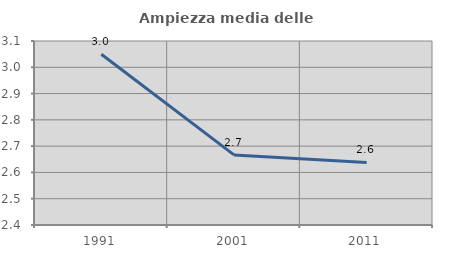
| Category | Ampiezza media delle famiglie |
|---|---|
| 1991.0 | 3.049 |
| 2001.0 | 2.667 |
| 2011.0 | 2.638 |